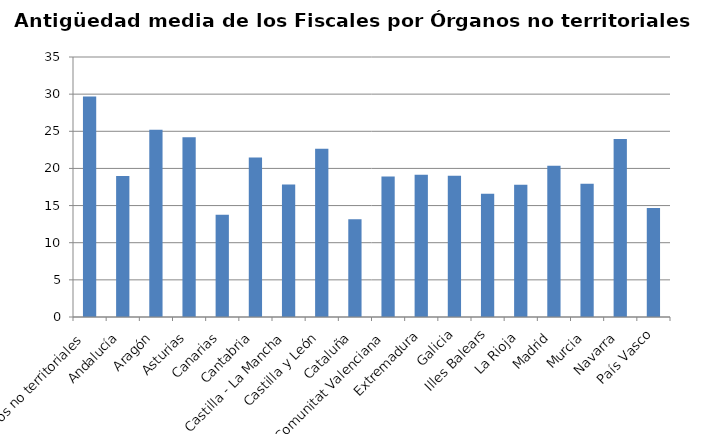
| Category | Series 0 |
|---|---|
| Órganos no territoriales | 29.674 |
| Andalucía | 18.974 |
| Aragón | 25.22 |
| Asturias | 24.2 |
| Canarias | 13.774 |
| Cantabria | 21.486 |
| Castilla - La Mancha | 17.847 |
| Castilla y León | 22.652 |
| Cataluña | 13.144 |
| Comunitat Valenciana | 18.901 |
| Extremadura | 19.134 |
| Galicia | 18.999 |
| Illes Balears | 16.586 |
| La Rioja | 17.792 |
| Madrid | 20.373 |
| Murcia | 17.942 |
| Navarra | 23.952 |
| País Vasco | 14.675 |